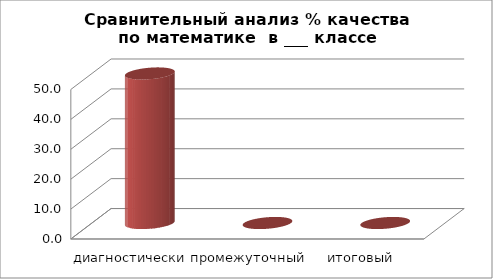
| Category | Series 0 |
|---|---|
| диагностический | 50 |
| промежуточный  | 0 |
| итоговый  | 0 |